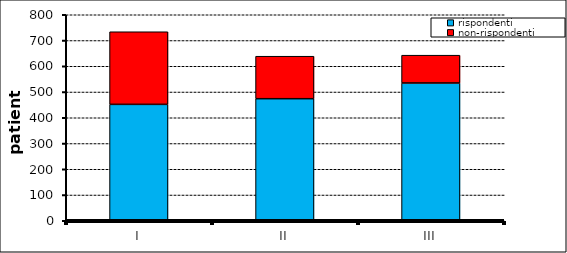
| Category | rispondenti | non-rispondenti |
|---|---|---|
| I | 452 | 282 |
| II | 474 | 165 |
| III | 535 | 108 |